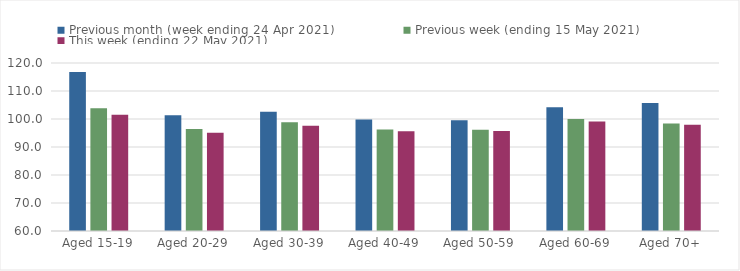
| Category | Previous month (week ending 24 Apr 2021) | Previous week (ending 15 May 2021) | This week (ending 22 May 2021) |
|---|---|---|---|
| Aged 15-19 | 116.76 | 103.81 | 101.56 |
| Aged 20-29 | 101.32 | 96.46 | 95.12 |
| Aged 30-39 | 102.55 | 98.86 | 97.57 |
| Aged 40-49 | 99.81 | 96.23 | 95.59 |
| Aged 50-59 | 99.59 | 96.17 | 95.7 |
| Aged 60-69 | 104.23 | 100.04 | 99.15 |
| Aged 70+ | 105.73 | 98.36 | 97.97 |